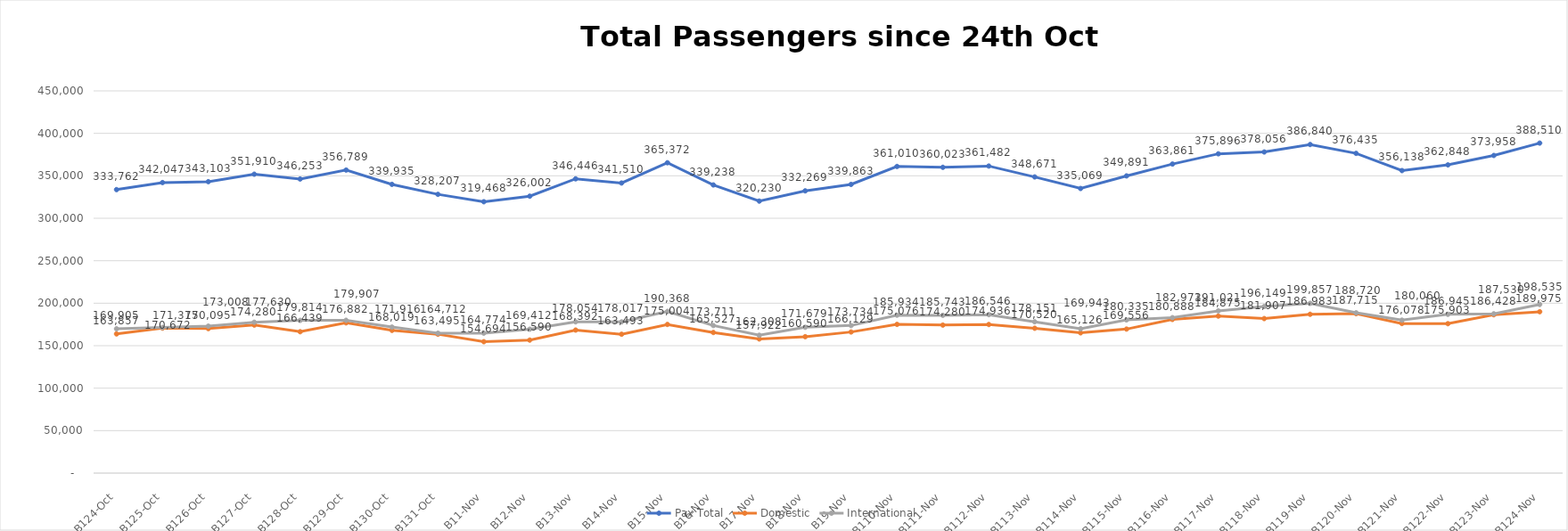
| Category | Pax Total | Domestic | International |
|---|---|---|---|
| 2023-10-24 | 333762 | 163857 | 169905 |
| 2023-10-25 | 342047 | 170672 | 171375 |
| 2023-10-26 | 343103 | 170095 | 173008 |
| 2023-10-27 | 351910 | 174280 | 177630 |
| 2023-10-28 | 346253 | 166439 | 179814 |
| 2023-10-29 | 356789 | 176882 | 179907 |
| 2023-10-30 | 339935 | 168019 | 171916 |
| 2023-10-31 | 328207 | 163495 | 164712 |
| 2023-11-01 | 319468 | 154694 | 164774 |
| 2023-11-02 | 326002 | 156590 | 169412 |
| 2023-11-03 | 346446 | 168392 | 178054 |
| 2023-11-04 | 341510 | 163493 | 178017 |
| 2023-11-05 | 365372 | 175004 | 190368 |
| 2023-11-06 | 339238 | 165527 | 173711 |
| 2023-11-07 | 320230 | 157922 | 162308 |
| 2023-11-08 | 332269 | 160590 | 171679 |
| 2023-11-09 | 339863 | 166129 | 173734 |
| 2023-11-10 | 361010 | 175076 | 185934 |
| 2023-11-11 | 360023 | 174280 | 185743 |
| 2023-11-12 | 361482 | 174936 | 186546 |
| 2023-11-13 | 348671 | 170520 | 178151 |
| 2023-11-14 | 335069 | 165126 | 169943 |
| 2023-11-15 | 349891 | 169556 | 180335 |
| 2023-11-16 | 363861 | 180888 | 182973 |
| 2023-11-17 | 375896 | 184875 | 191021 |
| 2023-11-18 | 378056 | 181907 | 196149 |
| 2023-11-19 | 386840 | 186983 | 199857 |
| 2023-11-20 | 376435 | 187715 | 188720 |
| 2023-11-21 | 356138 | 176078 | 180060 |
| 2023-11-22 | 362848 | 175903 | 186945 |
| 2023-11-23 | 373958 | 186428 | 187530 |
| 2023-11-24 | 388510 | 189975 | 198535 |